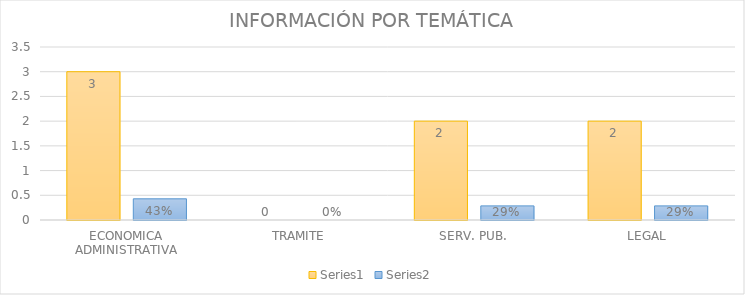
| Category | Series 3 | Series 4 |
|---|---|---|
| ECONOMICA ADMINISTRATIVA | 3 | 0.429 |
| TRAMITE | 0 | 0 |
| SERV. PUB. | 2 | 0.286 |
| LEGAL | 2 | 0.286 |